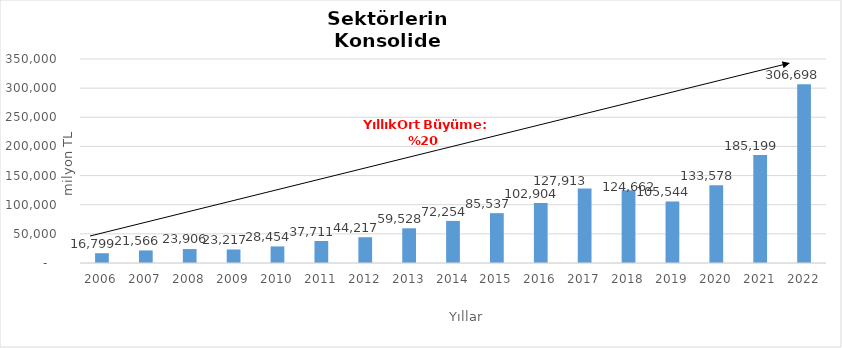
| Category | Toplam |
|---|---|
| 2006.0 | 16799.249 |
| 2007.0 | 21566.057 |
| 2008.0 | 23906.328 |
| 2009.0 | 23216.54 |
| 2010.0 | 28454.489 |
| 2011.0 | 37710.665 |
| 2012.0 | 44216.529 |
| 2013.0 | 59528.288 |
| 2014.0 | 72253.719 |
| 2015.0 | 85537 |
| 2016.0 | 102904 |
| 2017.0 | 127913 |
| 2018.0 | 124662 |
| 2019.0 | 105544 |
| 2020.0 | 133578 |
| 2021.0 | 185199 |
| 2022.0 | 306698 |